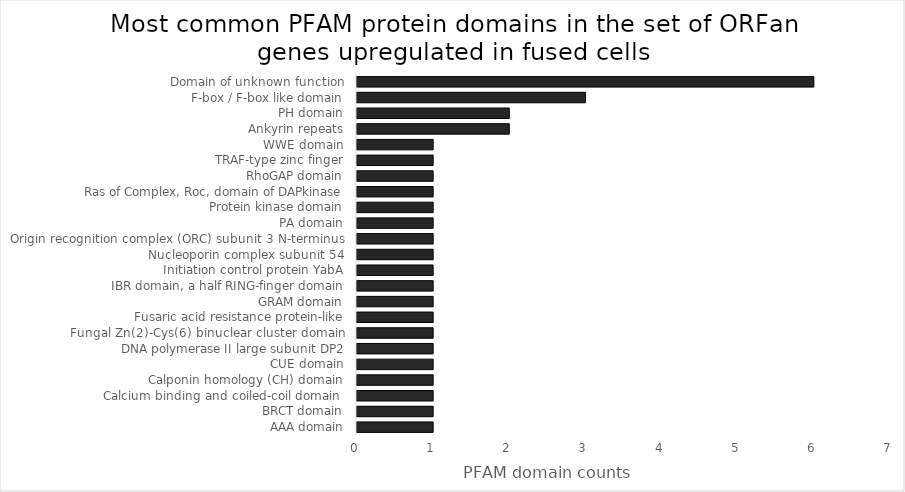
| Category | Count |
|---|---|
| AAA domain | 1 |
| BRCT domain | 1 |
| Calcium binding and coiled-coil domain  | 1 |
| Calponin homology (CH) domain | 1 |
| CUE domain | 1 |
| DNA polymerase II large subunit DP2 | 1 |
| Fungal Zn(2)-Cys(6) binuclear cluster domain | 1 |
| Fusaric acid resistance protein-like | 1 |
| GRAM domain | 1 |
| IBR domain, a half RING-finger domain | 1 |
| Initiation control protein YabA | 1 |
| Nucleoporin complex subunit 54 | 1 |
| Origin recognition complex (ORC) subunit 3 N-terminus | 1 |
| PA domain | 1 |
| Protein kinase domain | 1 |
| Ras of Complex, Roc, domain of DAPkinase | 1 |
| RhoGAP domain | 1 |
| TRAF-type zinc finger | 1 |
| WWE domain | 1 |
| Ankyrin repeats | 2 |
| PH domain | 2 |
| F-box / F-box like domain | 3 |
| Domain of unknown function | 6 |